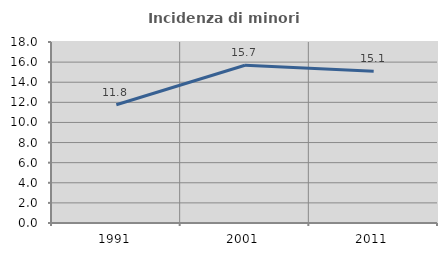
| Category | Incidenza di minori stranieri |
|---|---|
| 1991.0 | 11.765 |
| 2001.0 | 15.686 |
| 2011.0 | 15.079 |